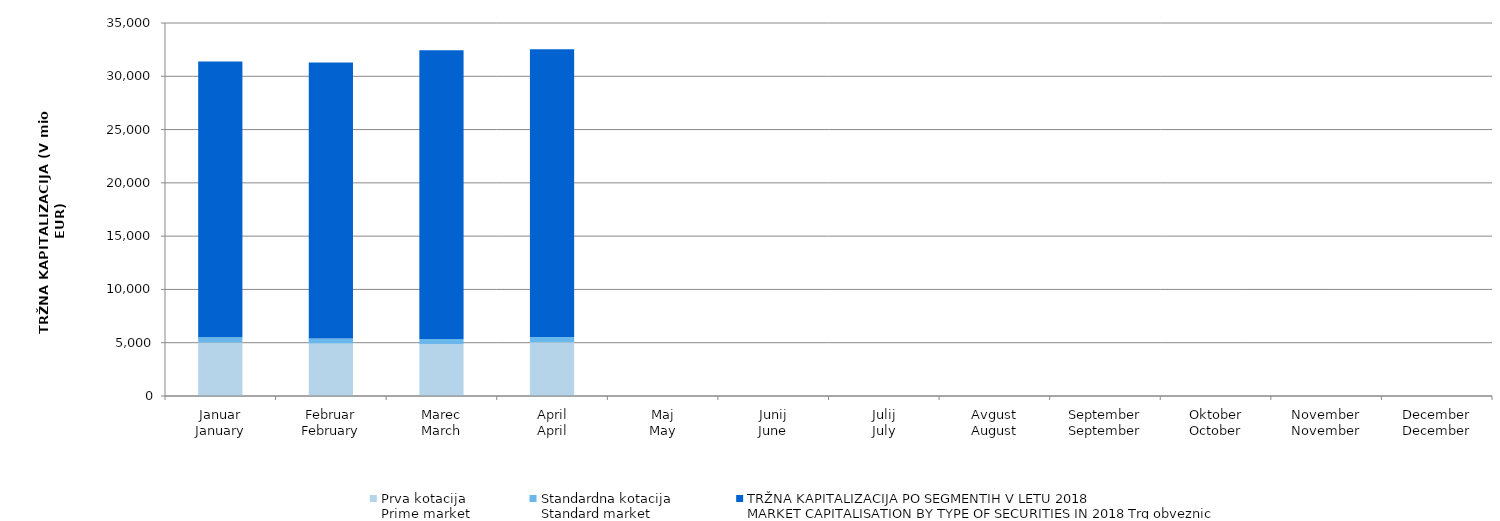
| Category | Prva kotacija
Prime market | Standardna kotacija
Standard market | Series 3 |
|---|---|---|---|
| Januar
January | 5022.792 | 483.67 | 25885.901 |
| Februar
February | 4922.405 | 471.165 | 25899.375 |
| Marec
March | 4884.025 | 463.212 | 27099.633 |
| April
April | 5038.448 | 492.653 | 27015.924 |
| Maj
May | 0 | 0 | 0 |
| Junij
June | 0 | 0 | 0 |
| Julij
July | 0 | 0 | 0 |
| Avgust
August | 0 | 0 | 0 |
| September
September | 0 | 0 | 0 |
| Oktober
October | 0 | 0 | 0 |
| November
November | 0 | 0 | 0 |
| December
December | 0 | 0 | 0 |